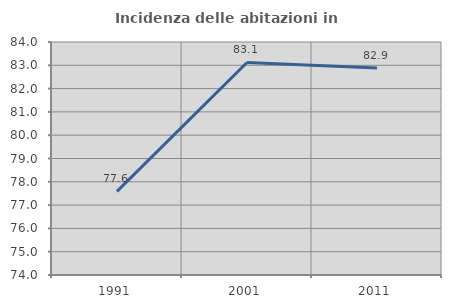
| Category | Incidenza delle abitazioni in proprietà  |
|---|---|
| 1991.0 | 77.59 |
| 2001.0 | 83.123 |
| 2011.0 | 82.888 |